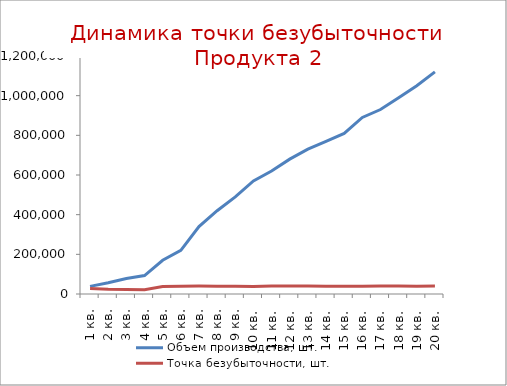
| Category | Объем производства, шт. | Точка безубыточности, шт. |
|---|---|---|
| 1 кв. | 38571.429 | 27787.869 |
| 2 кв. | 57142.857 | 23635.333 |
| 3 кв. | 78571.429 | 22531.508 |
| 4 кв. | 92857.143 | 20987.201 |
| 5 кв. | 170000 | 37298.769 |
| 6 кв. | 220000 | 38678.179 |
| 7 кв. | 340000 | 39839.969 |
| 8 кв. | 420000 | 39673.284 |
| 9 кв. | 490000 | 39072.604 |
| 10 кв. | 570000 | 38280.004 |
| 11 кв. | 620000 | 39854.804 |
| 12 кв. | 680000 | 39990.147 |
| 13 кв. | 730000 | 39952.814 |
| 14 кв. | 770000 | 39569.616 |
| 15 кв. | 810000 | 38832.863 |
| 16 кв. | 890000 | 38893.398 |
| 17 кв. | 930000 | 40791.784 |
| 18 кв. | 990000 | 40324 |
| 19 кв. | 1050000 | 39633.217 |
| 20 кв. | 1120000 | 39823.958 |